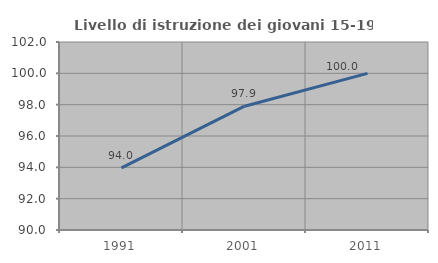
| Category | Livello di istruzione dei giovani 15-19 anni |
|---|---|
| 1991.0 | 93.97 |
| 2001.0 | 97.902 |
| 2011.0 | 100 |